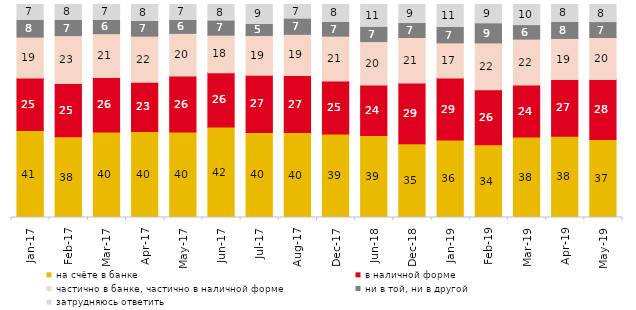
| Category | на счёте в банке | в наличной форме | частично в банке, частично в наличной форме | ни в той, ни в другой | затрудняюсь ответить |
|---|---|---|---|---|---|
| 2017-01-01 | 40.8 | 24.65 | 19.25 | 7.95 | 7.35 |
| 2017-02-01 | 37.9 | 25 | 22.5 | 7.1 | 7.5 |
| 2017-03-01 | 40.1 | 25.65 | 20.55 | 6.3 | 7.4 |
| 2017-04-01 | 40.4 | 23.05 | 21.7 | 6.95 | 7.9 |
| 2017-05-01 | 40.1 | 26.3 | 20.05 | 6.15 | 7.4 |
| 2017-06-01 | 42.45 | 25.5 | 17.65 | 6.75 | 7.65 |
| 2017-07-01 | 39.95 | 26.8 | 18.7 | 5.3 | 9.25 |
| 2017-08-01 | 39.85 | 26.8 | 19.35 | 7.25 | 6.75 |
| 2017-12-01 | 39.2 | 24.85 | 21.05 | 6.55 | 8.3 |
| 2018-06-01 | 38.5 | 23.65 | 20.45 | 6.8 | 10.6 |
| 2018-12-01 | 34.6 | 28.55 | 21.35 | 6.65 | 8.85 |
| 2019-01-01 | 36.35 | 29.1 | 16.55 | 7.35 | 10.65 |
| 2019-02-01 | 34.2 | 25.75 | 22 | 9.05 | 9 |
| 2019-03-01 | 37.842 | 24.316 | 21.581 | 6.365 | 9.896 |
| 2019-04-01 | 38.119 | 26.634 | 19.307 | 7.574 | 8.366 |
| 2019-05-01 | 36.652 | 28.083 | 19.762 | 7.033 | 8.47 |